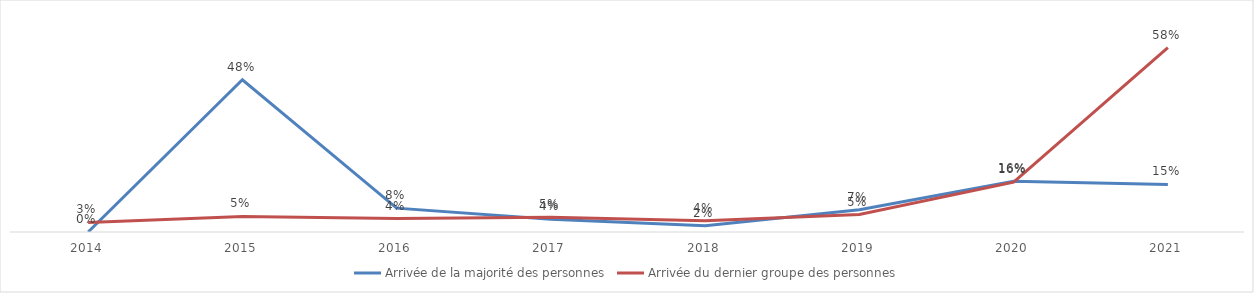
| Category | Arrivée de la majorité des personnes | Arrivée du dernier groupe des personnes |
|---|---|---|
| 2014.0 | 0 | 0.03 |
| 2015.0 | 0.48 | 0.049 |
| 2016.0 | 0.075 | 0.042 |
| 2017.0 | 0.04 | 0.046 |
| 2018.0 | 0.02 | 0.036 |
| 2019.0 | 0.07 | 0.055 |
| 2020.0 | 0.16 | 0.157 |
| 2021.0 | 0.15 | 0.582 |